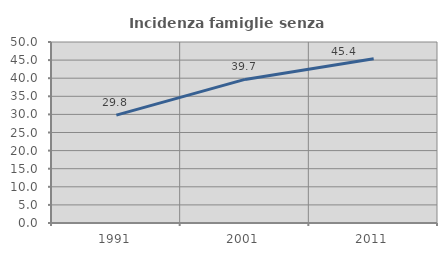
| Category | Incidenza famiglie senza nuclei |
|---|---|
| 1991.0 | 29.804 |
| 2001.0 | 39.661 |
| 2011.0 | 45.39 |